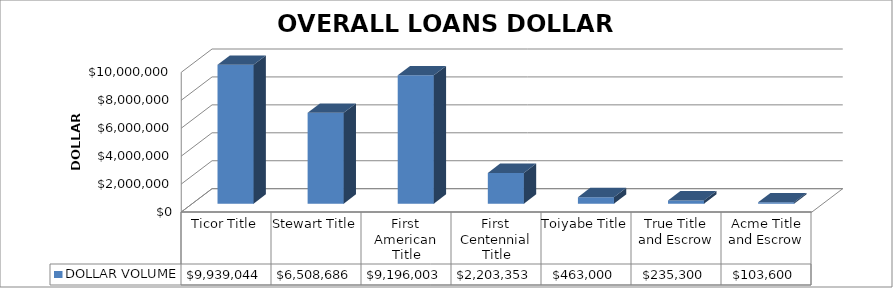
| Category | DOLLAR VOLUME |
|---|---|
| Ticor Title | 9939044 |
| Stewart Title | 6508686 |
| First American Title | 9196003 |
| First Centennial Title | 2203353 |
| Toiyabe Title | 463000 |
| True Title and Escrow | 235300 |
| Acme Title and Escrow | 103600 |